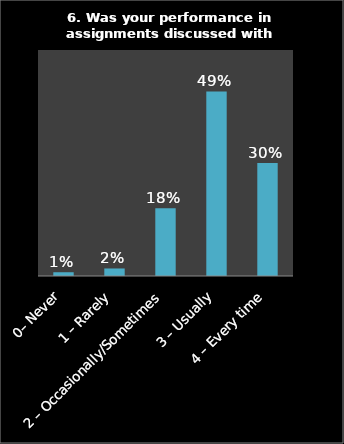
| Category | Series 0 |
|---|---|
| 0– Never | 0.01 |
| 1 – Rarely | 0.02 |
| 2 – Occasionally/Sometimes | 0.18 |
| 3 – Usually | 0.49 |
| 4 – Every time | 0.3 |